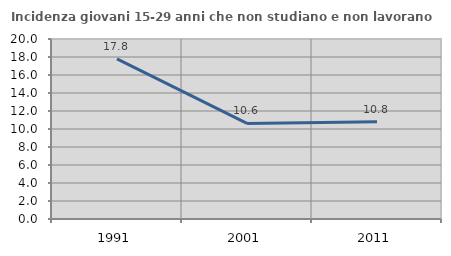
| Category | Incidenza giovani 15-29 anni che non studiano e non lavorano  |
|---|---|
| 1991.0 | 17.801 |
| 2001.0 | 10.619 |
| 2011.0 | 10.811 |